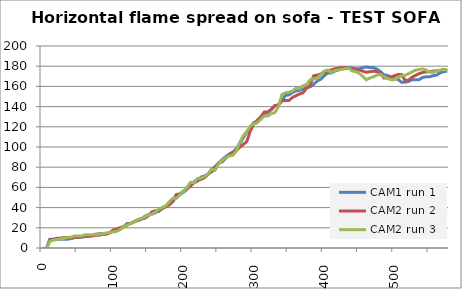
| Category | CAM1 run 1 | CAM2 run 2 | CAM2 run 3 |
|---|---|---|---|
| 0.0 | -1 | -1 | -1 |
| 5.0 | -1 | -1 | -1 |
| 10.0 | 8.742 | 7.471 | 6.537 |
| 15.0 | 8.742 | 8.595 | 7.726 |
| 20.0 | 8.742 | 9.722 | 8.32 |
| 25.0 | 8.742 | 9.722 | 8.914 |
| 30.0 | 8.742 | 10.286 | 9.509 |
| 35.0 | 8.742 | 10.286 | 10.697 |
| 40.0 | 9.28 | 10.239 | 10.697 |
| 45.0 | 10.358 | 10.239 | 11.886 |
| 50.0 | 10.358 | 10.806 | 11.886 |
| 55.0 | 10.856 | 10.806 | 11.886 |
| 60.0 | 11.398 | 11.374 | 13.074 |
| 65.0 | 11.398 | 11.941 | 13.074 |
| 70.0 | 12.481 | 11.941 | 13.074 |
| 75.0 | 13.564 | 12.508 | 13.669 |
| 80.0 | 14.106 | 12.508 | 13.669 |
| 85.0 | 14.096 | 13.643 | 14.263 |
| 90.0 | 14.106 | 13.643 | 14.857 |
| 95.0 | 15.189 | 14.778 | 15.452 |
| 100.0 | 16.767 | 17.926 | 15.86 |
| 105.0 | 17.981 | 18.455 | 16.416 |
| 110.0 | 18.588 | 20.178 | 18.114 |
| 115.0 | 20.903 | 21.328 | 21.511 |
| 120.0 | 22.639 | 24.236 | 22.65 |
| 125.0 | 24.376 | 24.236 | 24.348 |
| 130.0 | 26.114 | 25.959 | 25.48 |
| 135.0 | 27.272 | 27.682 | 28.309 |
| 140.0 | 28.431 | 28.831 | 29.441 |
| 145.0 | 31.327 | 29.406 | 30.573 |
| 150.0 | 33.065 | 31.704 | 32.837 |
| 155.0 | 33.645 | 35.728 | 33.403 |
| 160.0 | 34.803 | 36.878 | 35.667 |
| 165.0 | 37.121 | 36.303 | 38.497 |
| 170.0 | 38.86 | 39.753 | 40.195 |
| 175.0 | 41.178 | 40.903 | 41.893 |
| 180.0 | 43.515 | 42.628 | 45.855 |
| 185.0 | 45.832 | 46.654 | 49.252 |
| 190.0 | 51.649 | 52.982 | 49.252 |
| 195.0 | 52.785 | 53.557 | 52.648 |
| 200.0 | 55.102 | 56.434 | 56.053 |
| 205.0 | 58 | 59.31 | 60.014 |
| 210.0 | 62.056 | 61.036 | 65.108 |
| 215.0 | 64.374 | 65.639 | 64.542 |
| 220.0 | 66.113 | 67.366 | 69.082 |
| 225.0 | 70.186 | 67.941 | 69.082 |
| 230.0 | 71.329 | 69.667 | 70.779 |
| 235.0 | 73.067 | 73.136 | 73.609 |
| 240.0 | 77.719 | 75.437 | 78.136 |
| 245.0 | 80.602 | 78.908 | 77.005 |
| 250.0 | 84.08 | 84.085 | 83.261 |
| 255.0 | 87.557 | 85.235 | 86.639 |
| 260.0 | 90.455 | 88.687 | 89.468 |
| 265.0 | 92.774 | 92.714 | 91.166 |
| 270.0 | 93.354 | 95.015 | 91.732 |
| 275.0 | 98.57 | 96.166 | 95.693 |
| 280.0 | 103.208 | 99.618 | 104.748 |
| 285.0 | 109.004 | 102.495 | 110.973 |
| 290.0 | 114.801 | 105.371 | 115.501 |
| 295.0 | 119.438 | 115.728 | 120.595 |
| 300.0 | 124.076 | 122.621 | 122.859 |
| 305.0 | 125.235 | 126.64 | 123.991 |
| 310.0 | 128.734 | 130.094 | 127.386 |
| 315.0 | 132.211 | 134.707 | 130.782 |
| 320.0 | 134.53 | 134.707 | 130.782 |
| 325.0 | 137.428 | 137.019 | 133.046 |
| 330.0 | 140.905 | 141.048 | 134.178 |
| 335.0 | 141.485 | 141.623 | 139.83 |
| 340.0 | 146.065 | 145.537 | 151.855 |
| 345.0 | 151.043 | 146.117 | 153.696 |
| 350.0 | 151.613 | 146.117 | 154.274 |
| 355.0 | 153.892 | 149.016 | 155.429 |
| 360.0 | 155.602 | 150.756 | 158.318 |
| 365.0 | 156.172 | 152.496 | 157.739 |
| 370.0 | 157.312 | 153.656 | 160.628 |
| 375.0 | 158.451 | 158.295 | 161.785 |
| 380.0 | 159.591 | 160.614 | 166.407 |
| 385.0 | 161.871 | 170.486 | 167.563 |
| 390.0 | 165.29 | 171.074 | 168.141 |
| 395.0 | 167 | 172.234 | 171.622 |
| 400.0 | 170.419 | 173.973 | 175.108 |
| 405.0 | 173.276 | 175.133 | 176.263 |
| 410.0 | 173.276 | 176.292 | 173.952 |
| 415.0 | 174.994 | 177.452 | 175.685 |
| 420.0 | 176.169 | 178.031 | 176.263 |
| 425.0 | 177.952 | 178.611 | 176.867 |
| 430.0 | 177.974 | 178.611 | 177.461 |
| 435.0 | 178.653 | 178.031 | 178.056 |
| 440.0 | 178.084 | 177.452 | 175.169 |
| 445.0 | 177.515 | 176.292 | 174.591 |
| 450.0 | 177.515 | 176.292 | 172.859 |
| 455.0 | 178.623 | 175.133 | 169.992 |
| 460.0 | 179.192 | 173.973 | 166.576 |
| 465.0 | 178.685 | 174.544 | 168.307 |
| 470.0 | 178.718 | 175.133 | 169.462 |
| 475.0 | 177.125 | 174.553 | 171.193 |
| 480.0 | 174.851 | 172.814 | 171.771 |
| 485.0 | 171.44 | 168.251 | 169.488 |
| 490.0 | 170.872 | 168.251 | 167.757 |
| 495.0 | 169.166 | 169.43 | 166.663 |
| 500.0 | 167.505 | 170.589 | 166.663 |
| 505.0 | 166.982 | 171.748 | 169.003 |
| 510.0 | 164.143 | 171.748 | 170.348 |
| 515.0 | 164.143 | 165.977 | 170.924 |
| 520.0 | 164.915 | 166.124 | 172.653 |
| 525.0 | 166.673 | 169.169 | 174.382 |
| 530.0 | 166.673 | 170.904 | 176.11 |
| 535.0 | 166.673 | 172.639 | 176.687 |
| 540.0 | 168.942 | 173.796 | 177.305 |
| 545.0 | 169.509 | 174.375 | 176.198 |
| 550.0 | 169.509 | 174.416 | 173.941 |
| 555.0 | 170.643 | 175.038 | 173.99 |
| 560.0 | 171.211 | 175.616 | 175.141 |
| 565.0 | 173.48 | 175.616 | 176.292 |
| 570.0 | 174.614 | 176.817 | 176.448 |
| 575.0 | 175.182 | 175.661 | 176.562 |